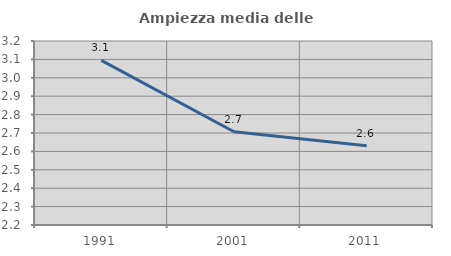
| Category | Ampiezza media delle famiglie |
|---|---|
| 1991.0 | 3.094 |
| 2001.0 | 2.707 |
| 2011.0 | 2.631 |